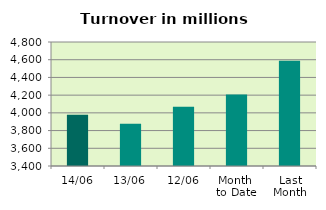
| Category | Series 0 |
|---|---|
| 14/06 | 3977.854 |
| 13/06 | 3875.781 |
| 12/06 | 4069.006 |
| Month 
to Date | 4206.303 |
| Last
Month | 4586.899 |